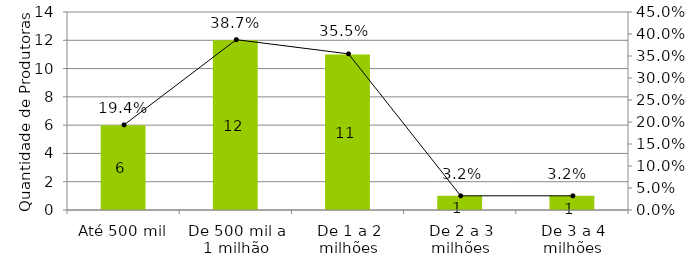
| Category | QTD de Produtoras |
|---|---|
| Até 500 mil | 6 |
| De 500 mil a 1 milhão | 12 |
| De 1 a 2 milhões | 11 |
| De 2 a 3 milhões | 1 |
| De 3 a 4 milhões | 1 |